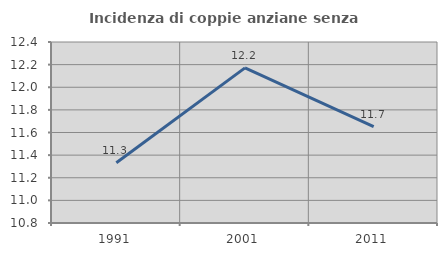
| Category | Incidenza di coppie anziane senza figli  |
|---|---|
| 1991.0 | 11.332 |
| 2001.0 | 12.171 |
| 2011.0 | 11.652 |